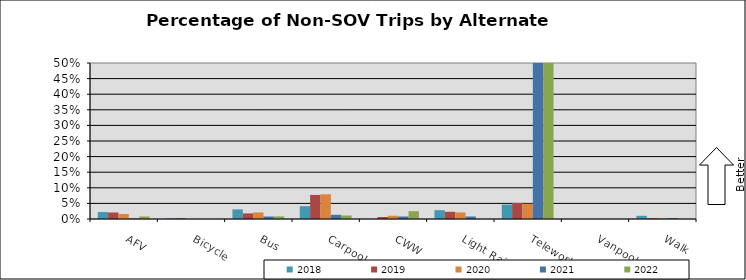
| Category | 2018 | 2019 | 2020 | 2021 | 2022 |
|---|---|---|---|---|---|
| AFV | 0.022 | 0.021 | 0.016 | 0.002 | 0.008 |
| Bicycle | 0.003 | 0.003 | 0 | 0 | 0 |
| Bus | 0.031 | 0.018 | 0.021 | 0.008 | 0.008 |
| Carpool | 0.041 | 0.077 | 0.079 | 0.013 | 0.011 |
| CWW | 0 | 0.006 | 0.01 | 0.008 | 0.025 |
| Light Rail | 0.028 | 0.023 | 0.021 | 0.008 | 0 |
| Telework | 0.046 | 0.051 | 0.049 | 0.657 | 0.507 |
| Vanpool | 0 | 0 | 0 | 0 | 0 |
| Walk | 0.01 | 0.003 | 0.002 | 0.003 | 0 |